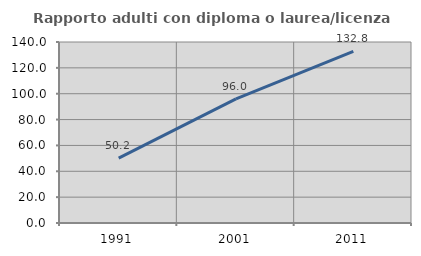
| Category | Rapporto adulti con diploma o laurea/licenza media  |
|---|---|
| 1991.0 | 50.181 |
| 2001.0 | 96.038 |
| 2011.0 | 132.818 |